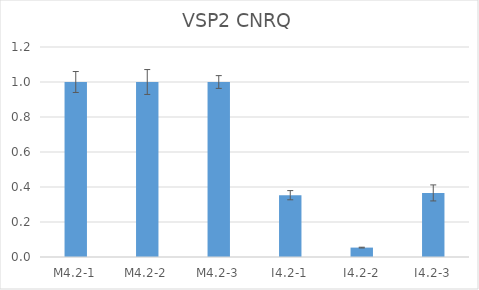
| Category | VSP2 CNRQ |
|---|---|
| M4.2-1 | 1 |
| M4.2-2 | 1 |
| M4.2-3 | 1 |
| I4.2-1 | 0.353 |
| I4.2-2 | 0.054 |
| I4.2-3 | 0.366 |